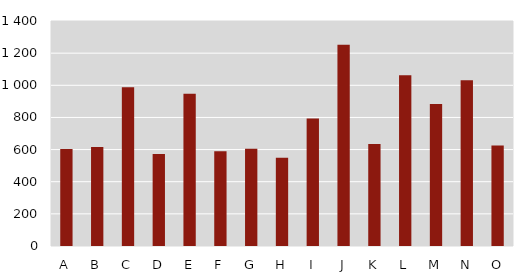
| Category | Series 0 |
|---|---|
| А | 604 |
| B | 616 |
| C | 988 |
| D | 572 |
| E | 947 |
| F | 589 |
| G | 605 |
| H | 549 |
| I | 793 |
| J | 1252 |
| K | 635 |
| L | 1063 |
| M | 883 |
| N | 1031 |
| O | 626 |